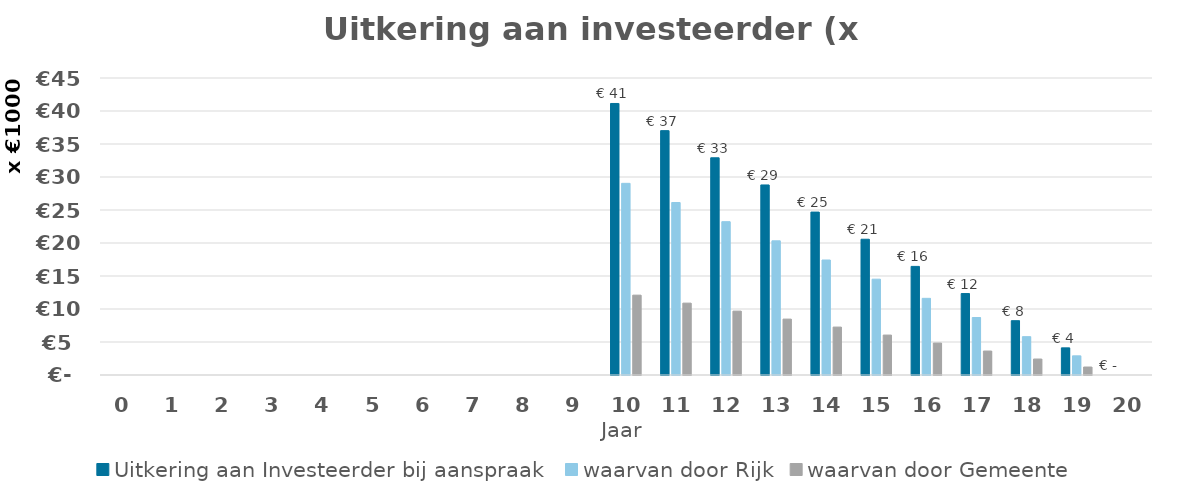
| Category | Uitkering aan Investeerder bij aanspraak | waarvan door Rijk | waarvan door Gemeente |
|---|---|---|---|
| 0.0 | 0 | 0 | 0 |
| 1.0 | 0 | 0 | 0 |
| 2.0 | 0 | 0 | 0 |
| 3.0 | 0 | 0 | 0 |
| 4.0 | 0 | 0 | 0 |
| 5.0 | 0 | 0 | 0 |
| 6.0 | 0 | 0 | 0 |
| 7.0 | 0 | 0 | 0 |
| 8.0 | 0 | 0 | 0 |
| 9.0 | 0 | 0 | 0 |
| 10.0 | 41139.15 | 29039.4 | 12099.75 |
| 11.0 | 37025.15 | 26135.4 | 10889.75 |
| 12.0 | 32911.15 | 23231.4 | 9679.75 |
| 13.0 | 28797.15 | 20327.4 | 8469.75 |
| 14.0 | 24683.15 | 17423.4 | 7259.75 |
| 15.0 | 20569.15 | 14519.4 | 6049.75 |
| 16.0 | 16455.15 | 11615.4 | 4839.75 |
| 17.0 | 12341.15 | 8711.4 | 3629.75 |
| 18.0 | 8227.15 | 5807.4 | 2419.75 |
| 19.0 | 4113.15 | 2903.4 | 1209.75 |
| 20.0 | 0 | 0 | 0 |